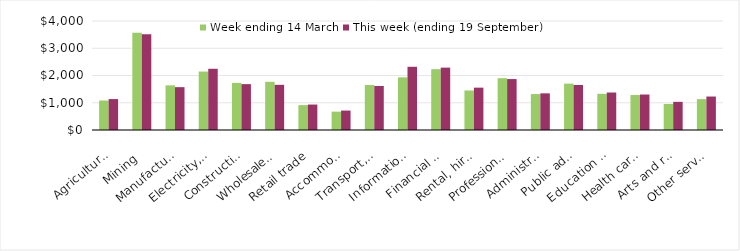
| Category | Week ending 14 March | This week (ending 19 September) |
|---|---|---|
| Agriculture, forestry and fishing | 1082.67 | 1135.06 |
| Mining | 3572.85 | 3509.73 |
| Manufacturing | 1638.25 | 1572.34 |
| Electricity, gas, water and waste services | 2144.18 | 2246.72 |
| Construction | 1728.39 | 1683.74 |
| Wholesale trade | 1768.11 | 1657.81 |
| Retail trade | 913.76 | 933.73 |
| Accommodation and food services | 673.67 | 713.4 |
| Transport, postal and warehousing | 1652.49 | 1614.81 |
| Information media and telecommunications | 1932.75 | 2320 |
| Financial and insurance services | 2232.02 | 2288.52 |
| Rental, hiring and real estate services | 1449.77 | 1554.18 |
| Professional, scientific and technical services | 1899.84 | 1868.88 |
| Administrative and support services | 1319.48 | 1345.34 |
| Public administration and safety | 1701.55 | 1650.52 |
| Education and training | 1327.46 | 1375.54 |
| Health care and social assistance | 1283.27 | 1301.89 |
| Arts and recreation services | 956.45 | 1033.17 |
| Other services | 1132.37 | 1228.01 |